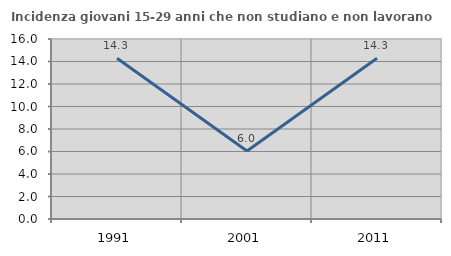
| Category | Incidenza giovani 15-29 anni che non studiano e non lavorano  |
|---|---|
| 1991.0 | 14.286 |
| 2001.0 | 6.048 |
| 2011.0 | 14.286 |